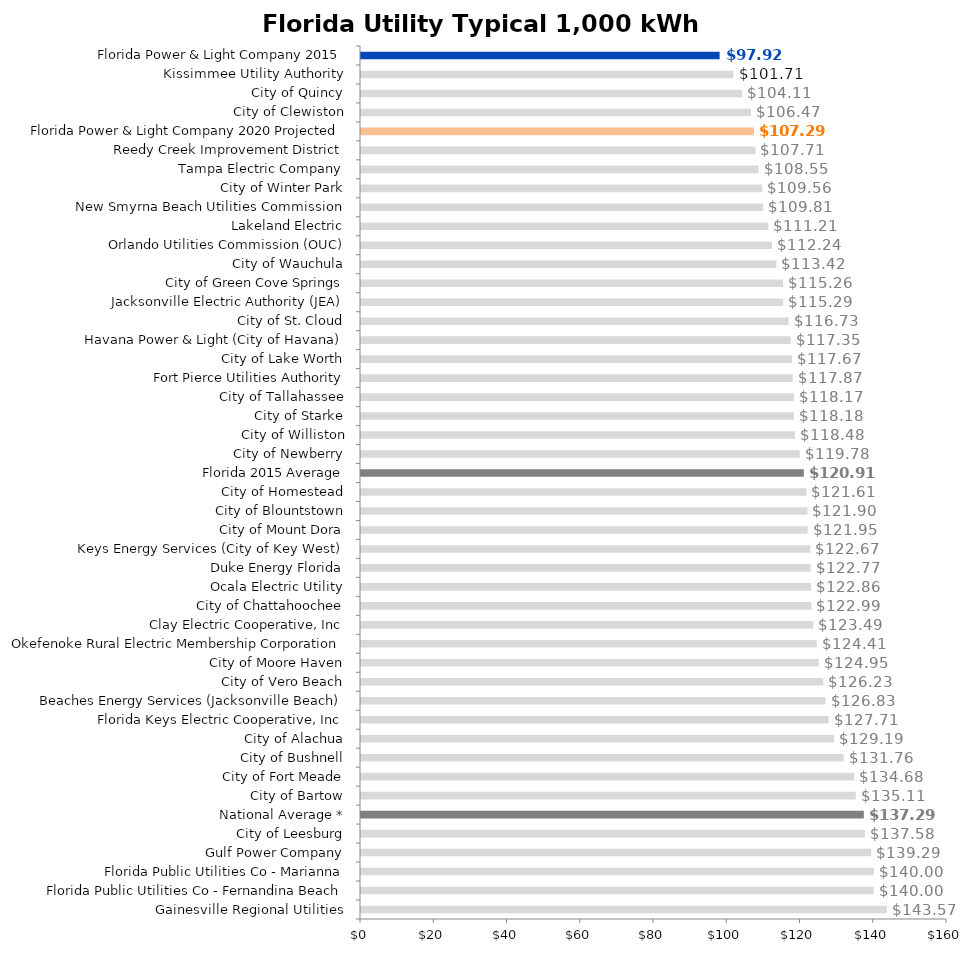
| Category | Avg bill |
|---|---|
| Gainesville Regional Utilities | 143.57 |
| Florida Public Utilities Co - Fernandina Beach | 140 |
| Florida Public Utilities Co - Marianna | 140 |
| Gulf Power Company | 139.29 |
| City of Leesburg | 137.582 |
| National Average * | 137.29 |
| City of Bartow | 135.111 |
| City of Fort Meade | 134.677 |
| City of Bushnell | 131.759 |
| City of Alachua | 129.187 |
| Florida Keys Electric Cooperative, Inc | 127.713 |
| Beaches Energy Services (Jacksonville Beach) | 126.832 |
| City of Vero Beach | 126.226 |
| City of Moore Haven | 124.948 |
| Okefenoke Rural Electric Membership Corporation | 124.41 |
| Clay Electric Cooperative, Inc | 123.485 |
| City of Chattahoochee | 122.994 |
| Ocala Electric Utility | 122.863 |
| Duke Energy Florida | 122.77 |
| Keys Energy Services (City of Key West) | 122.674 |
| City of Mount Dora | 121.945 |
| City of Blountstown | 121.9 |
| City of Homestead | 121.612 |
| Florida 2015 Average | 120.91 |
| City of Newberry | 119.784 |
| City of Williston | 118.478 |
| City of Starke | 118.182 |
| City of Tallahassee | 118.17 |
| Fort Pierce Utilities Authority | 117.873 |
| City of Lake Worth | 117.67 |
| Havana Power & Light (City of Havana) | 117.353 |
| City of St. Cloud | 116.73 |
| Jacksonville Electric Authority (JEA) | 115.29 |
| City of Green Cove Springs | 115.257 |
| City of Wauchula | 113.418 |
| Orlando Utilities Commission (OUC) | 112.24 |
| Lakeland Electric | 111.206 |
| New Smyrna Beach Utilities Commission | 109.81 |
| City of Winter Park | 109.559 |
| Tampa Electric Company | 108.545 |
| Reedy Creek Improvement District | 107.71 |
| Florida Power & Light Company 2020 Projected | 107.29 |
| City of Clewiston | 106.468 |
| City of Quincy | 104.112 |
| Kissimmee Utility Authority | 101.714 |
| Florida Power & Light Company 2015 | 97.917 |